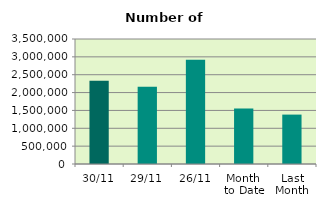
| Category | Series 0 |
|---|---|
| 30/11 | 2328666 |
| 29/11 | 2161608 |
| 26/11 | 2918374 |
| Month 
to Date | 1553278.182 |
| Last
Month | 1383348.571 |